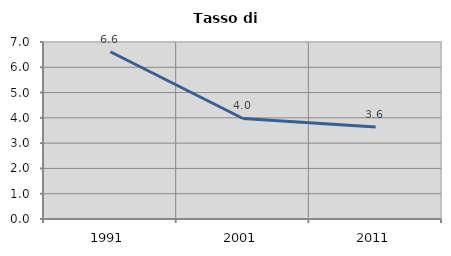
| Category | Tasso di disoccupazione   |
|---|---|
| 1991.0 | 6.614 |
| 2001.0 | 3.976 |
| 2011.0 | 3.634 |